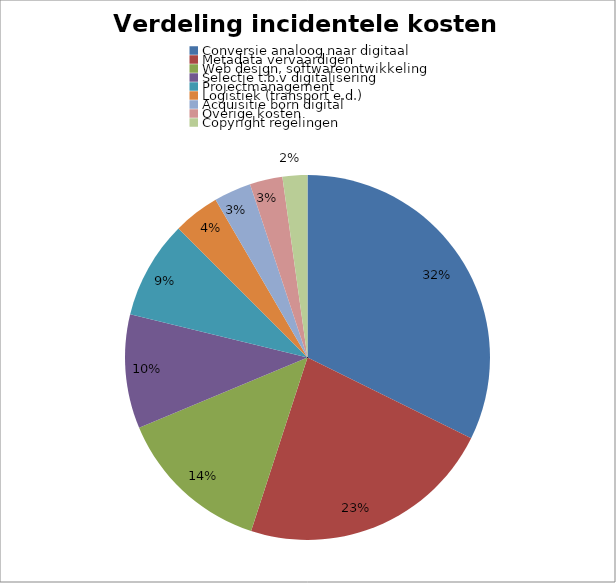
| Category | Series 0 |
|---|---|
| Conversie analoog naar digitaal | 32.3 |
| Metadata vervaardigen | 22.7 |
| Web design, softwareontwikkeling | 13.7 |
| Selectie t.b.v digitalisering | 10.1 |
| Projectmanagement | 8.7 |
| Logistiek (transport e.d.) | 4.1 |
| Acquisitie born digital | 3.3 |
| Overige kosten | 2.9 |
| Copyright regelingen | 2.2 |